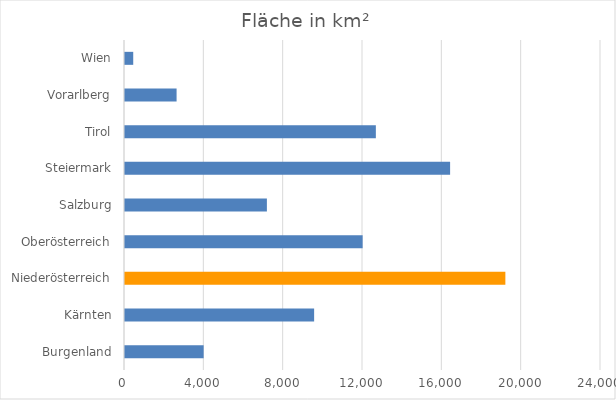
| Category | Fläche in km² |
|---|---|
| Burgenland | 3965 |
| Kärnten | 9536 |
| Niederösterreich | 19178 |
| Oberösterreich | 11982 |
| Salzburg | 7154 |
| Steiermark | 16392 |
| Tirol | 12648 |
| Vorarlberg | 2601 |
| Wien | 415 |